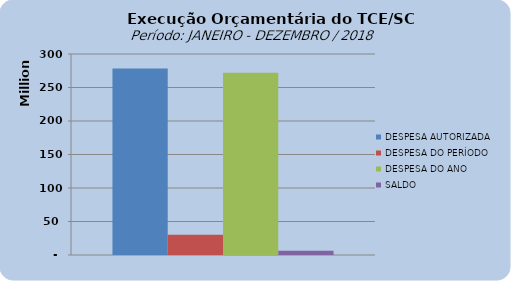
| Category | DESPESA AUTORIZADA | DESPESA DO PERÍODO | DESPESA DO ANO | SALDO |
|---|---|---|---|---|
| 0 | 278251734.27 | 30140099.11 | 271953515.64 | 6298218.63 |